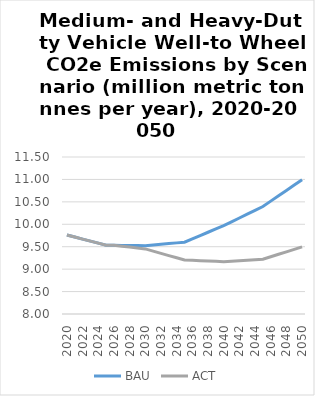
| Category | BAU | ACT |
|---|---|---|
| 2020.0 | 9.761 | 9.761 |
| 2021.0 | 9.716 | 9.716 |
| 2022.0 | 9.67 | 9.67 |
| 2023.0 | 9.625 | 9.625 |
| 2024.0 | 9.579 | 9.579 |
| 2025.0 | 9.534 | 9.534 |
| 2026.0 | 9.532 | 9.532 |
| 2027.0 | 9.53 | 9.512 |
| 2028.0 | 9.527 | 9.491 |
| 2029.0 | 9.525 | 9.471 |
| 2030.0 | 9.523 | 9.451 |
| 2031.0 | 9.539 | 9.401 |
| 2032.0 | 9.554 | 9.352 |
| 2033.0 | 9.57 | 9.302 |
| 2034.0 | 9.586 | 9.253 |
| 2035.0 | 9.601 | 9.204 |
| 2036.0 | 9.675 | 9.196 |
| 2037.0 | 9.749 | 9.189 |
| 2038.0 | 9.822 | 9.182 |
| 2039.0 | 9.896 | 9.174 |
| 2040.0 | 9.97 | 9.167 |
| 2041.0 | 10.055 | 9.178 |
| 2042.0 | 10.141 | 9.189 |
| 2043.0 | 10.226 | 9.199 |
| 2044.0 | 10.311 | 9.21 |
| 2045.0 | 10.397 | 9.221 |
| 2046.0 | 10.516 | 9.276 |
| 2047.0 | 10.635 | 9.331 |
| 2048.0 | 10.755 | 9.386 |
| 2049.0 | 10.874 | 9.441 |
| 2050.0 | 10.993 | 9.496 |